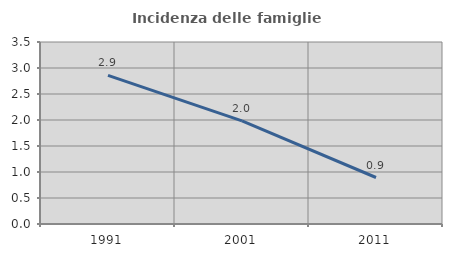
| Category | Incidenza delle famiglie numerose |
|---|---|
| 1991.0 | 2.857 |
| 2001.0 | 1.982 |
| 2011.0 | 0.894 |